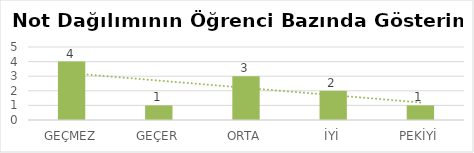
| Category | Series 2 |
|---|---|
| GEÇMEZ | 4 |
| GEÇER | 1 |
| ORTA | 3 |
| İYİ | 2 |
| PEKİYİ | 1 |